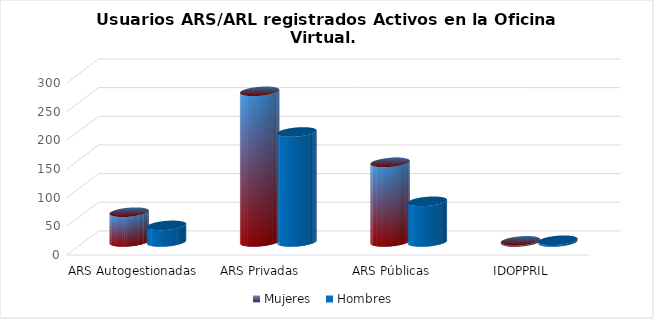
| Category | Mujeres | Hombres |
|---|---|---|
| ARS Autogestionadas | 52 | 29 |
| ARS Privadas | 263 | 192 |
| ARS Públicas | 139 | 71 |
| IDOPPRIL | 2 | 3 |